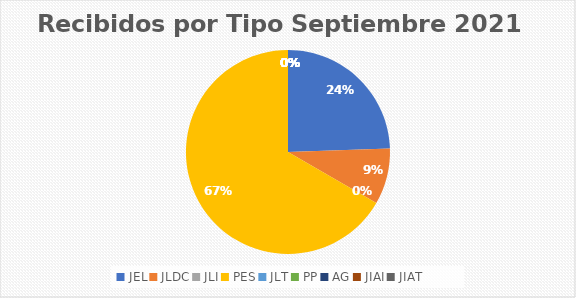
| Category | Series 0 |
|---|---|
| JEL | 11 |
| JLDC | 4 |
| JLI | 0 |
| PES | 30 |
| JLT | 0 |
| PP | 0 |
| AG | 0 |
| JIAI | 0 |
| JIAT | 0 |